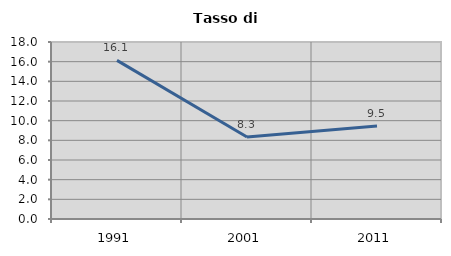
| Category | Tasso di disoccupazione   |
|---|---|
| 1991.0 | 16.129 |
| 2001.0 | 8.333 |
| 2011.0 | 9.47 |